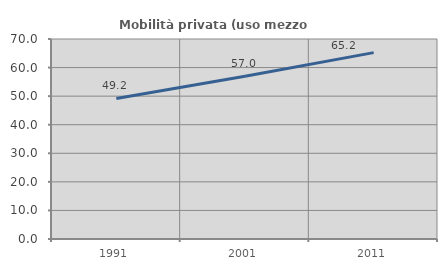
| Category | Mobilità privata (uso mezzo privato) |
|---|---|
| 1991.0 | 49.189 |
| 2001.0 | 56.967 |
| 2011.0 | 65.234 |